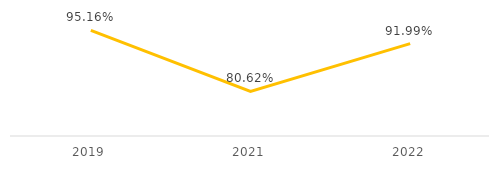
| Category | Series 0 |
|---|---|
| 2019.0 | 0.952 |
| 2021.0 | 0.806 |
| 2022.0 | 0.92 |